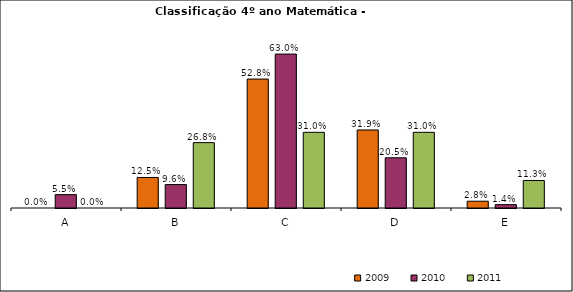
| Category | 2009 | 2010 | 2011 |
|---|---|---|---|
| A | 0 | 0.055 | 0 |
| B | 0.125 | 0.096 | 0.268 |
| C | 0.528 | 0.63 | 0.31 |
| D | 0.319 | 0.205 | 0.31 |
| E | 0.028 | 0.014 | 0.113 |